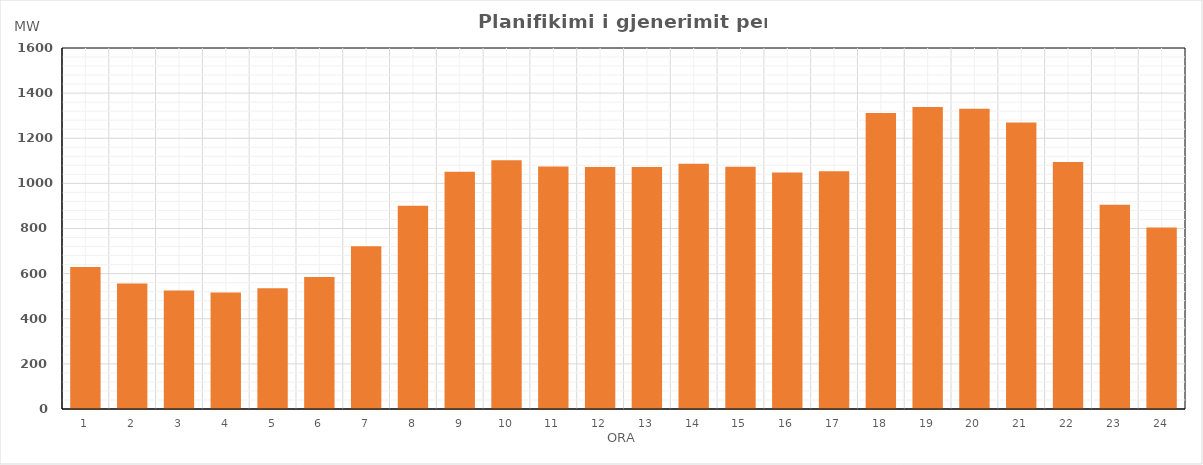
| Category | Max (MW) |
|---|---|
| 0 | 628.869 |
| 1 | 555.854 |
| 2 | 525.37 |
| 3 | 515.94 |
| 4 | 534.928 |
| 5 | 585.084 |
| 6 | 721.494 |
| 7 | 900.667 |
| 8 | 1051.927 |
| 9 | 1102.17 |
| 10 | 1074.957 |
| 11 | 1072.204 |
| 12 | 1072.387 |
| 13 | 1087.116 |
| 14 | 1074.038 |
| 15 | 1047.749 |
| 16 | 1053.255 |
| 17 | 1311.434 |
| 18 | 1338.195 |
| 19 | 1331.293 |
| 20 | 1270.124 |
| 21 | 1095.03 |
| 22 | 905.386 |
| 23 | 804.673 |